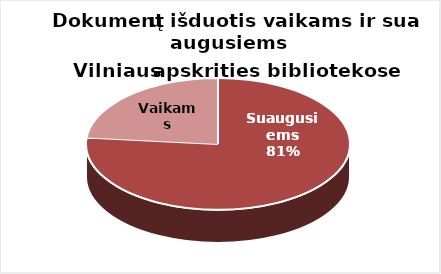
| Category | Series 0 |
|---|---|
| Suaugusiems | 1346979 |
| Vaikams | 412987 |